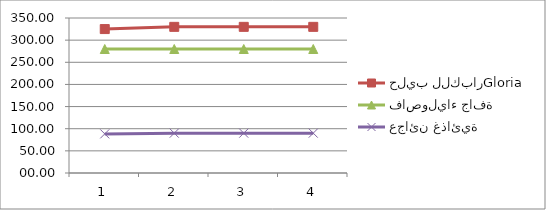
| Category | حليب للكبارGloria   | فاصولياء جافة | عجائن غذائية |
|---|---|---|---|
| 0 | 325 | 280 | 88.33 |
| 1 | 330 | 280 | 90 |
| 2 | 330 | 280 | 90 |
| 3 | 330 | 280 | 90 |